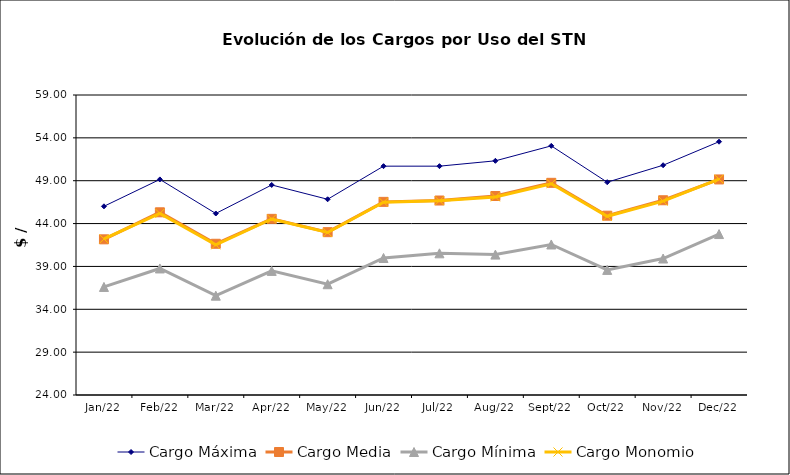
| Category | Cargo Máxima | Cargo Media | Cargo Mínima | Cargo Monomio |
|---|---|---|---|---|
| 2022-01-01 | 46.015 | 42.161 | 36.608 | 42.209 |
| 2022-02-01 | 49.151 | 45.315 | 38.762 | 45.186 |
| 2022-03-01 | 45.176 | 41.643 | 35.585 | 41.521 |
| 2022-04-01 | 48.504 | 44.55 | 38.479 | 44.533 |
| 2022-05-01 | 46.835 | 42.997 | 36.923 | 42.956 |
| 2022-06-01 | 50.697 | 46.532 | 39.983 | 46.494 |
| 2022-07-01 | 50.697 | 46.689 | 40.529 | 46.663 |
| 2022-08-01 | 51.321 | 47.215 | 40.38 | 47.112 |
| 2022-09-01 | 53.065 | 48.754 | 41.561 | 48.649 |
| 2022-10-01 | 48.826 | 44.918 | 38.598 | 44.848 |
| 2022-11-01 | 50.808 | 46.721 | 39.923 | 46.621 |
| 2022-12-01 | 53.551 | 49.148 | 42.777 | 49.192 |